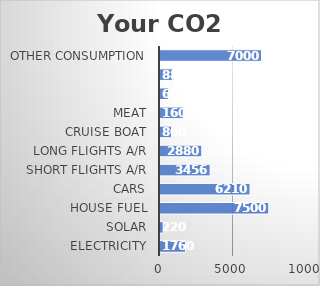
| Category | Series 0 |
|---|---|
| Electricity | 1760 |
| Solar | 220 |
| House Fuel | 7500 |
| Cars | 621 |
| Short Flights A/R | 3456 |
| Long Flights A/R | 2880 |
| Cruise boat | 800 |
| Meat | 1600 |
|  | 600 |
|  | 880 |
| Other consumption | 7000 |